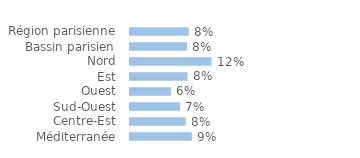
| Category | Series 0 |
|---|---|
| Région parisienne | 0.084 |
| Bassin parisien | 0.082 |
| Nord | 0.117 |
| Est | 0.083 |
| Ouest | 0.059 |
| Sud-Ouest | 0.072 |
| Centre-Est | 0.08 |
| Méditerranée | 0.089 |